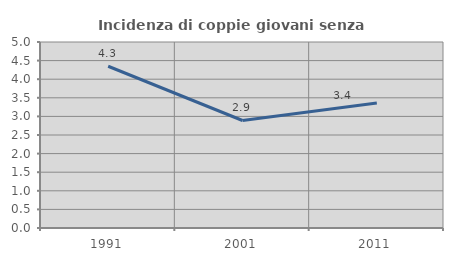
| Category | Incidenza di coppie giovani senza figli |
|---|---|
| 1991.0 | 4.348 |
| 2001.0 | 2.89 |
| 2011.0 | 3.361 |